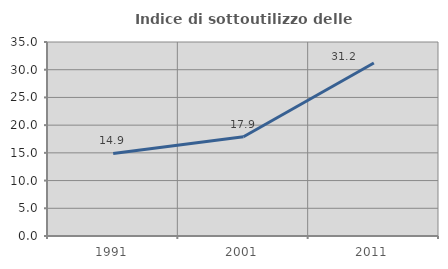
| Category | Indice di sottoutilizzo delle abitazioni  |
|---|---|
| 1991.0 | 14.904 |
| 2001.0 | 17.912 |
| 2011.0 | 31.206 |